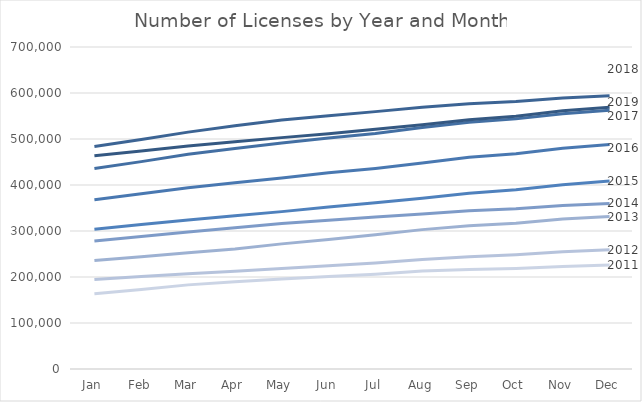
| Category | 2011 | 2012 | 2013 | 2014 | 2015 | 2016 | 2017 | 2018 | 2019 |
|---|---|---|---|---|---|---|---|---|---|
| Jan | 163649 | 194424 | 235752 | 278372 | 303635 | 367891 | 435643 | 483621 | 463482 |
| Feb | 172931 | 201177 | 244282 | 288287 | 314101 | 380842 | 450824 | 499064 | 474057 |
| Mar | 182881 | 207189 | 252558 | 297656 | 323658 | 394171 | 466914 | 514969 | 484541 |
| Apr | 189849 | 212368 | 261012 | 307267 | 332948 | 405062 | 479344 | 528827 | 493789 |
| May | 195612 | 218634 | 272016 | 316172 | 342119 | 415454 | 491284 | 541071 | 502978 |
| Jun | 201083 | 224375 | 281341 | 323137 | 351940 | 426475 | 502013 | 550661 | 511366 |
| Jul | 206029 | 230611 | 291641 | 330369 | 361654 | 436032 | 512122 | 559519 | 520994 |
| Aug | 212930 | 238124 | 302997 | 337083 | 371202 | 447652 | 524793 | 569002 | 531230 |
| Sep | 216523 | 244165 | 311593 | 343800 | 382291 | 460372 | 536235 | 576473 | 541751 |
| Oct | 218631 | 248618 | 316614 | 348356 | 389812 | 467836 | 543753 | 581618 | 549656 |
| Nov | 222925 | 254843 | 326143 | 355187 | 400510 | 479811 | 555117 | 589024 | 561402 |
| Dec | 226021 | 259005 | 331351 | 359992 | 408542 | 487973 | 562760 | 594041 | 569190 |